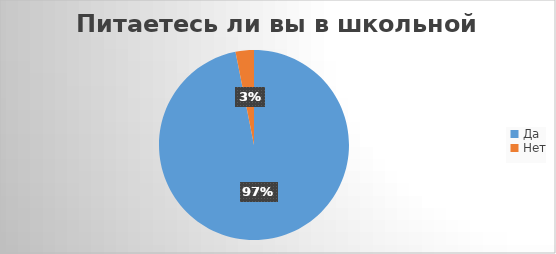
| Category | Series 0 |
|---|---|
| Да | 93 |
| Нет | 3 |